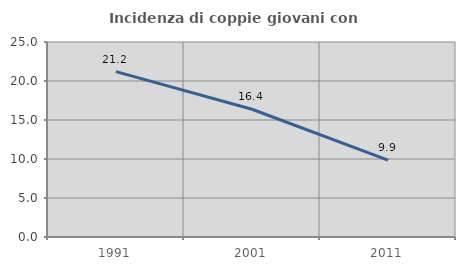
| Category | Incidenza di coppie giovani con figli |
|---|---|
| 1991.0 | 21.201 |
| 2001.0 | 16.376 |
| 2011.0 | 9.867 |